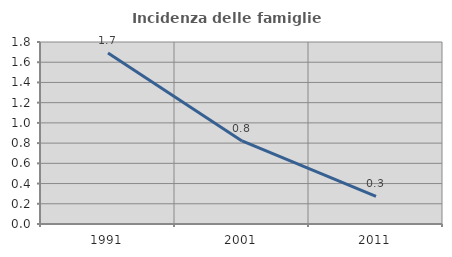
| Category | Incidenza delle famiglie numerose |
|---|---|
| 1991.0 | 1.69 |
| 2001.0 | 0.822 |
| 2011.0 | 0.272 |